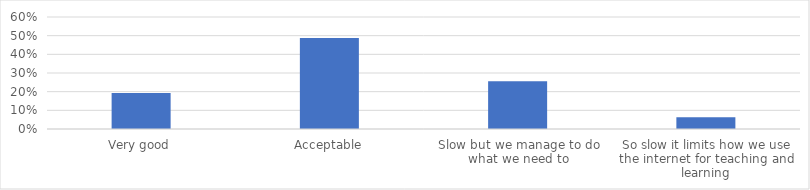
| Category | % of Respondents |
|---|---|
| Very good | 0.193 |
| Acceptable | 0.488 |
| Slow but we manage to do what we need to | 0.256 |
| So slow it limits how we use the internet for teaching and learning | 0.063 |